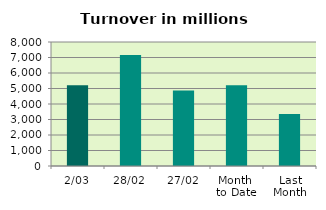
| Category | Series 0 |
|---|---|
| 2/03 | 5202.605 |
| 28/02 | 7159.506 |
| 27/02 | 4873.432 |
| Month 
to Date | 5202.605 |
| Last
Month | 3347.876 |